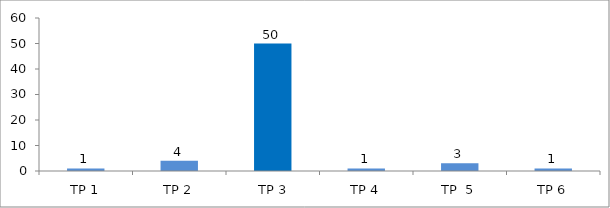
| Category | BIL. MURID |
|---|---|
| TP 1 | 1 |
| TP 2 | 4 |
|  TP 3 | 50 |
| TP 4 | 1 |
| TP  5 | 3 |
| TP 6 | 1 |